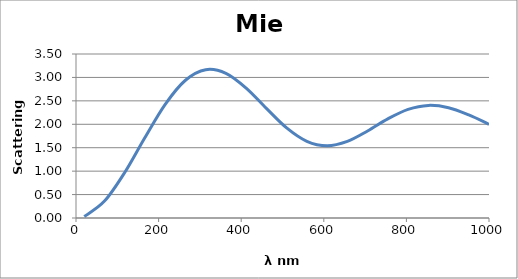
| Category | Series 0 |
|---|---|
| 20.0 | 0.031 |
| 69.0 | 0.361 |
| 118.0 | 0.972 |
| 167.0 | 1.719 |
| 216.0 | 2.426 |
| 265.0 | 2.94 |
| 314.0 | 3.165 |
| 363.0 | 3.088 |
| 412.0 | 2.773 |
| 461.0 | 2.339 |
| 510.0 | 1.923 |
| 559.0 | 1.637 |
| 608.0 | 1.542 |
| 657.0 | 1.636 |
| 706.0 | 1.857 |
| 755.0 | 2.115 |
| 804.0 | 2.318 |
| 853.0 | 2.403 |
| 902.0 | 2.354 |
| 951.0 | 2.198 |
| 1000.0 | 2 |